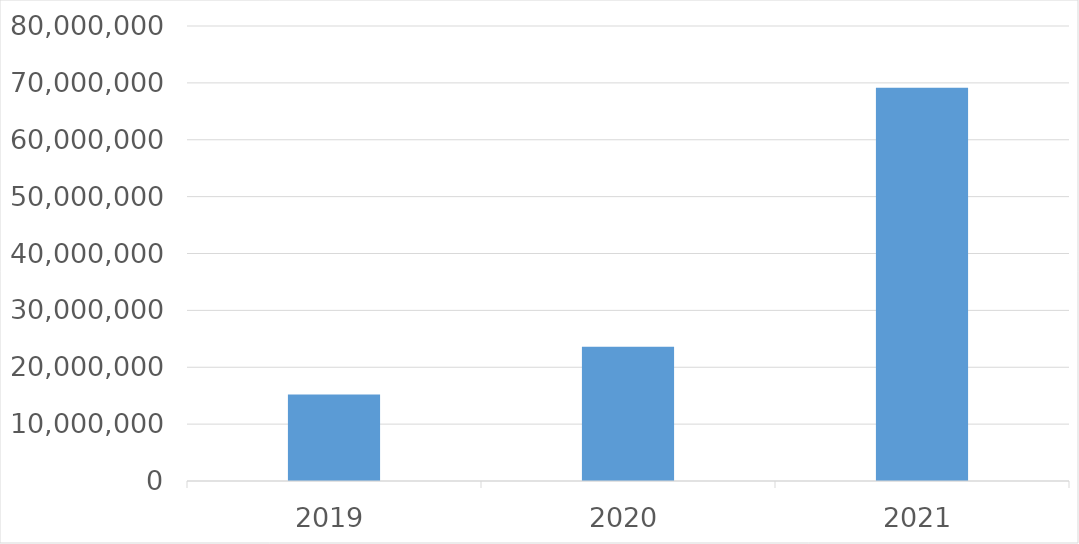
| Category | Series 0 |
|---|---|
| 2019 | 15191931 |
| 2020 | 23611590 |
| 2021 | 69150172 |